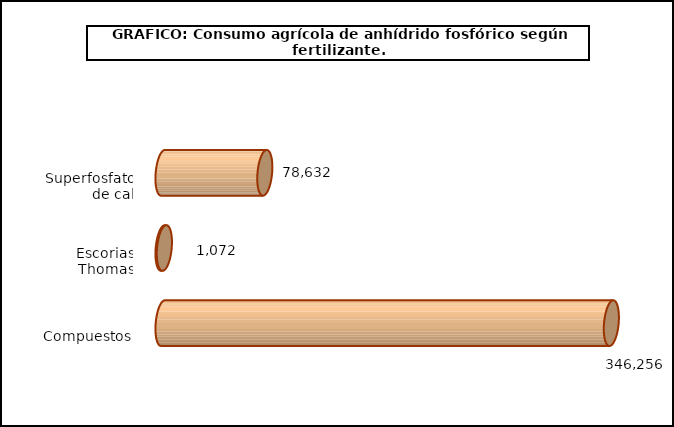
| Category | fert. N |
|---|---|
| 0 | 78632 |
| 1 | 1072 |
| 2 | 346256 |